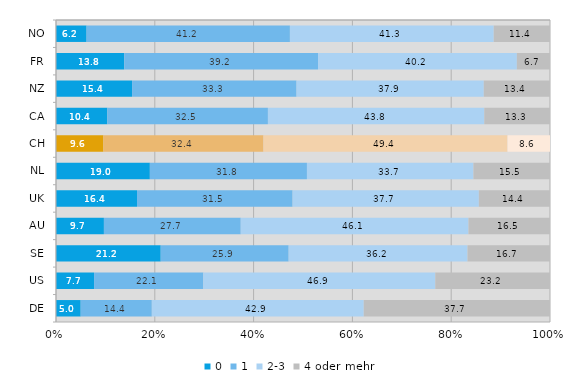
| Category | 0 | 1 | 2-3 | 4 oder mehr |
|---|---|---|---|---|
| NO | 6.2 | 41.2 | 41.3 | 11.4 |
| FR | 13.8 | 39.2 | 40.2 | 6.7 |
| NZ | 15.4 | 33.3 | 37.9 | 13.4 |
| CA | 10.4 | 32.5 | 43.8 | 13.3 |
| CH | 9.6 | 32.4 | 49.4 | 8.6 |
| NL | 19 | 31.8 | 33.7 | 15.5 |
| UK | 16.4 | 31.5 | 37.7 | 14.4 |
| AU | 9.7 | 27.7 | 46.1 | 16.5 |
| SE | 21.2 | 25.9 | 36.2 | 16.7 |
| US | 7.7 | 22.1 | 46.9 | 23.2 |
| DE | 5 | 14.4 | 42.9 | 37.7 |